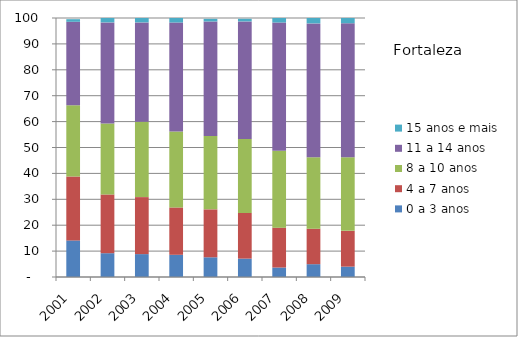
| Category | 0 a 3 anos | 4 a 7 anos | 8 a 10 anos | 11 a 14 anos | 15 anos e mais |
|---|---|---|---|---|---|
| 2001.0 | 14.13 | 24.66 | 27.52 | 32.23 | 1 |
| 2002.0 | 9.19 | 22.68 | 27.42 | 39.02 | 1.69 |
| 2003.0 | 8.84 | 22 | 29.11 | 38.36 | 1.69 |
| 2004.0 | 8.57 | 18.28 | 29.32 | 42.09 | 1.73 |
| 2005.0 | 7.61 | 18.51 | 28.32 | 44.23 | 1 |
| 2006.0 | 7.1 | 17.64 | 28.59 | 45.36 | 1 |
| 2007.0 | 3.66 | 15.4 | 29.73 | 49.47 | 1.74 |
| 2008.0 | 4.95 | 13.7 | 27.59 | 51.68 | 2.09 |
| 2009.0 | 4 | 13.82 | 28.44 | 51.72 | 2.02 |